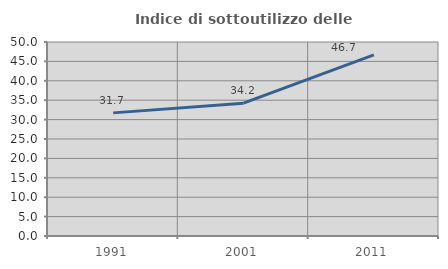
| Category | Indice di sottoutilizzo delle abitazioni  |
|---|---|
| 1991.0 | 31.733 |
| 2001.0 | 34.234 |
| 2011.0 | 46.667 |